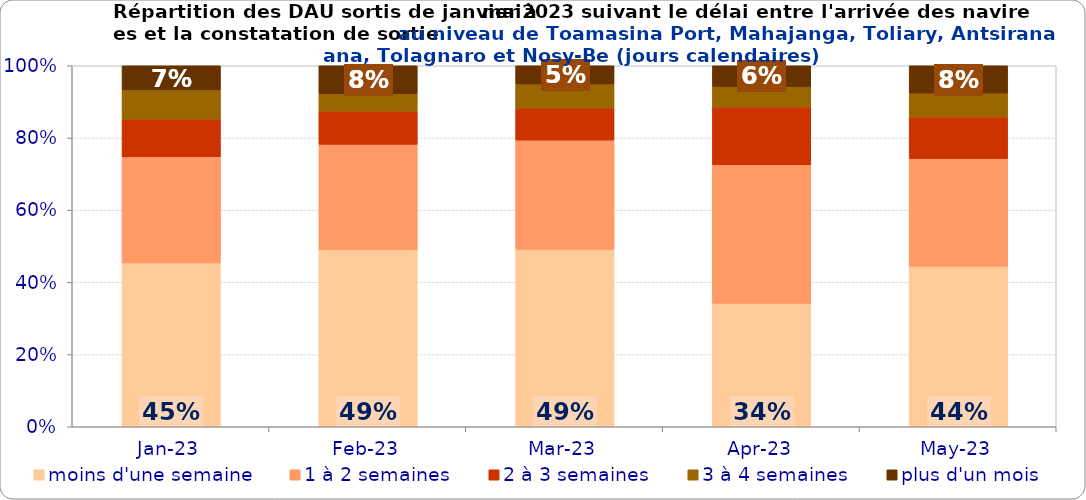
| Category | moins d'une semaine | 1 à 2 semaines | 2 à 3 semaines | 3 à 4 semaines | plus d'un mois |
|---|---|---|---|---|---|
| 2023-01-01 | 0.454 | 0.294 | 0.104 | 0.081 | 0.067 |
| 2023-02-01 | 0.49 | 0.292 | 0.092 | 0.048 | 0.078 |
| 2023-03-01 | 0.492 | 0.303 | 0.089 | 0.066 | 0.051 |
| 2023-04-01 | 0.342 | 0.384 | 0.16 | 0.057 | 0.057 |
| 2023-05-01 | 0.444 | 0.299 | 0.115 | 0.066 | 0.076 |